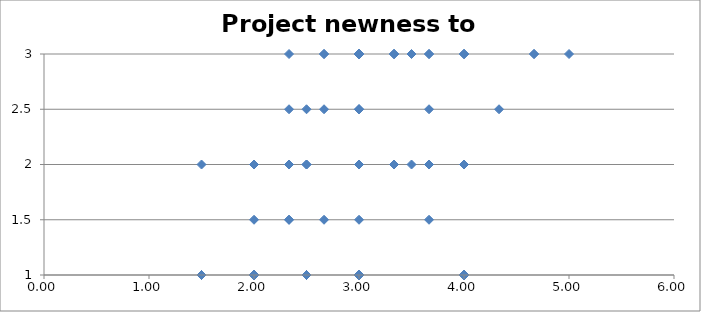
| Category | Project newness to market |
|---|---|
| 2.3333333333333335 | 2 |
| 3.0 | 1 |
| 2.5 | 1 |
| 3.0 | 1 |
| 4.0 | 1 |
| 2.0 | 1.5 |
| 3.0 | 3 |
| 2.0 | 1 |
| 3.0 | 3 |
| 1.5 | 2 |
| 4.0 | 1 |
| 2.5 | 1 |
| 3.0 | 3 |
| 4.0 | 3 |
| 2.6666666666666665 | 3 |
| 4.0 | 1 |
| 3.0 | 1 |
| 2.5 | 1 |
| 2.0 | 1 |
| 3.0 | 1 |
| 2.5 | 1 |
| 2.5 | 2 |
| 2.5 | 1 |
| 2.6666666666666665 | 1.5 |
| 2.3333333333333335 | 1.5 |
| 3.0 | 2 |
| 3.6666666666666665 | 3 |
| 2.3333333333333335 | 2 |
| 3.0 | 1 |
| 3.0 | 3 |
| 3.0 | 2 |
| 3.0 | 1 |
| 2.0 | 1 |
| 3.5 | 2 |
| 2.0 | 1 |
| 3.6666666666666665 | 2 |
| 3.0 | 2.5 |
| 3.3333333333333335 | 3 |
| 2.5 | 2 |
| 4.0 | 2 |
| 3.0 | 1 |
| 3.0 | 2 |
| 3.0 | 1 |
| 3.0 | 1 |
| 3.0 | 1 |
| 3.0 | 1 |
| 3.0 | 1 |
| 3.0 | 1 |
| 2.6666666666666665 | 3 |
| 4.0 | 3 |
| 3.0 | 1.5 |
| 2.5 | 1 |
| 5.0 | 3 |
| 3.0 | 2 |
| 3.0 | 1 |
| 3.0 | 1 |
| 3.0 | 1 |
| 3.0 | 1 |
| 2.5 | 1 |
| 3.0 | 1 |
| 3.6666666666666665 | 1.5 |
| 2.3333333333333335 | 3 |
| 3.6666666666666665 | 2.5 |
| 3.0 | 2 |
| 3.0 | 2 |
| 2.0 | 2 |
| 2.0 | 2 |
| 2.5 | 1 |
| 3.0 | 2.5 |
| 2.0 | 1 |
| 3.0 | 1 |
| 3.0 | 1 |
| 2.0 | 1 |
| 4.0 | 1 |
| 2.3333333333333335 | 1.5 |
| 3.0 | 3 |
| 4.666666666666667 | 3 |
| 1.5 | 1 |
| 3.0 | 1 |
| 3.6666666666666665 | 2 |
| 3.0 | 3 |
| 3.0 | 1 |
| 2.0 | 1 |
| 4.0 | 2 |
| 3.3333333333333335 | 3 |
| 3.6666666666666665 | 3 |
| 4.333333333333333 | 2.5 |
| 1.5 | 1 |
| 4.0 | 2 |
| 2.6666666666666665 | 2.5 |
| 4.0 | 1 |
| 2.0 | 1 |
| 2.0 | 1 |
| 2.5 | 1 |
| 4.666666666666667 | 3 |
| 3.0 | 3 |
| 2.5 | 2.5 |
| 2.0 | 1 |
| 2.0 | 1 |
| 3.5 | 3 |
| 3.0 | 1 |
| 3.3333333333333335 | 3 |
| 3.0 | 2 |
| 3.3333333333333335 | 2 |
| 3.0 | 2 |
| 3.0 | 1 |
| 2.3333333333333335 | 2.5 |
| 3.0 | 1 |
| 4.0 | 1 |
| 4.0 | 3 |
| 3.0 | 2.5 |
| 3.0 | 3 |
| 3.0 | 1 |
| 3.0 | 2 |
| 3.0 | 2 |